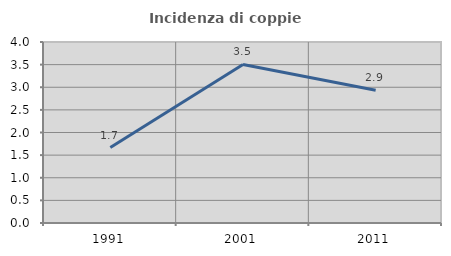
| Category | Incidenza di coppie miste |
|---|---|
| 1991.0 | 1.667 |
| 2001.0 | 3.503 |
| 2011.0 | 2.933 |